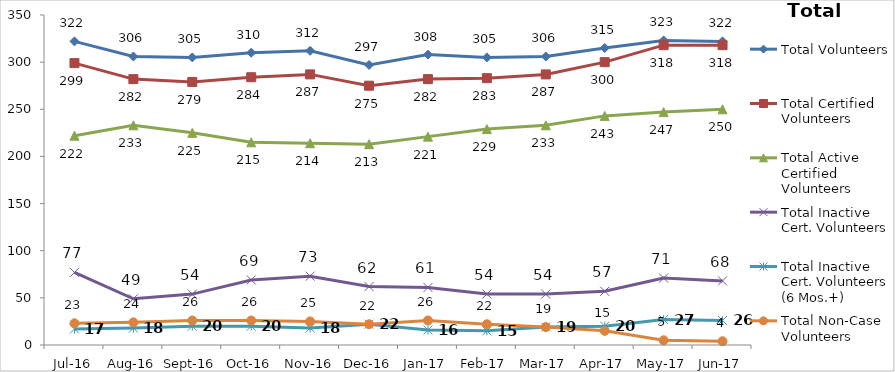
| Category | Total Volunteers | Total Certified Volunteers | Total Active Certified Volunteers | Total Inactive Cert. Volunteers | Total Inactive Cert. Volunteers (6 Mos.+) | Total Non-Case Volunteers |
|---|---|---|---|---|---|---|
| Jul-16 | 322 | 299 | 222 | 77 | 17 | 23 |
| Aug-16 | 306 | 282 | 233 | 49 | 18 | 24 |
| Sep-16 | 305 | 279 | 225 | 54 | 20 | 26 |
| Oct-16 | 310 | 284 | 215 | 69 | 20 | 26 |
| Nov-16 | 312 | 287 | 214 | 73 | 18 | 25 |
| Dec-16 | 297 | 275 | 213 | 62 | 22 | 22 |
| Jan-17 | 308 | 282 | 221 | 61 | 16 | 26 |
| Feb-17 | 305 | 283 | 229 | 54 | 15 | 22 |
| Mar-17 | 306 | 287 | 233 | 54 | 19 | 19 |
| Apr-17 | 315 | 300 | 243 | 57 | 20 | 15 |
| May-17 | 323 | 318 | 247 | 71 | 27 | 5 |
| Jun-17 | 322 | 318 | 250 | 68 | 26 | 4 |